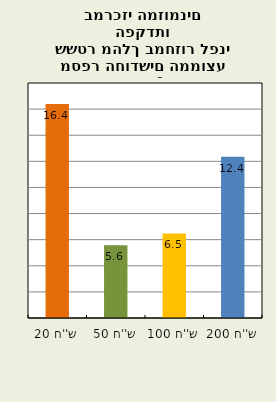
| Category | מספר חודשים עד שמחזור השטרות נספר |
|---|---|
| 20 ש''ח | 16.385 |
| 50 ש''ח | 5.564 |
| 100 ש''ח | 6.479 |
| 200 ש''ח | 12.357 |